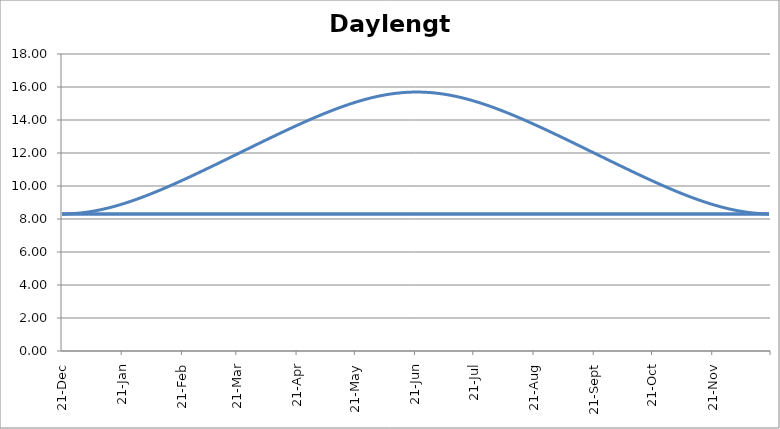
| Category | Daylength |
|---|---|
| 2006-12-21 | 8.306 |
| 2006-12-22 | 8.307 |
| 2006-12-23 | 8.309 |
| 2006-12-24 | 8.312 |
| 2006-12-25 | 8.317 |
| 2006-12-26 | 8.323 |
| 2006-12-27 | 8.33 |
| 2006-12-28 | 8.338 |
| 2006-12-29 | 8.348 |
| 2006-12-30 | 8.36 |
| 2006-12-31 | 8.372 |
| 2007-01-01 | 8.386 |
| 2007-01-02 | 8.401 |
| 2007-01-03 | 8.417 |
| 2007-01-04 | 8.435 |
| 2007-01-05 | 8.453 |
| 2007-01-06 | 8.473 |
| 2007-01-07 | 8.494 |
| 2007-01-08 | 8.517 |
| 2007-01-09 | 8.54 |
| 2007-01-10 | 8.565 |
| 2007-01-11 | 8.59 |
| 2007-01-12 | 8.617 |
| 2007-01-13 | 8.645 |
| 2007-01-14 | 8.674 |
| 2007-01-15 | 8.704 |
| 2007-01-16 | 8.735 |
| 2007-01-17 | 8.767 |
| 2007-01-18 | 8.8 |
| 2007-01-19 | 8.834 |
| 2007-01-20 | 8.869 |
| 2007-01-21 | 8.904 |
| 2007-01-22 | 8.941 |
| 2007-01-23 | 8.978 |
| 2007-01-24 | 9.017 |
| 2007-01-25 | 9.056 |
| 2007-01-26 | 9.096 |
| 2007-01-27 | 9.137 |
| 2007-01-28 | 9.178 |
| 2007-01-29 | 9.22 |
| 2007-01-30 | 9.263 |
| 2007-01-31 | 9.307 |
| 2007-02-01 | 9.351 |
| 2007-02-02 | 9.396 |
| 2007-02-03 | 9.442 |
| 2007-02-04 | 9.488 |
| 2007-02-05 | 9.535 |
| 2007-02-06 | 9.582 |
| 2007-02-07 | 9.63 |
| 2007-02-08 | 9.678 |
| 2007-02-09 | 9.727 |
| 2007-02-10 | 9.776 |
| 2007-02-11 | 9.826 |
| 2007-02-12 | 9.876 |
| 2007-02-13 | 9.927 |
| 2007-02-14 | 9.978 |
| 2007-02-15 | 10.03 |
| 2007-02-16 | 10.082 |
| 2007-02-17 | 10.134 |
| 2007-02-18 | 10.187 |
| 2007-02-19 | 10.24 |
| 2007-02-20 | 10.293 |
| 2007-02-21 | 10.346 |
| 2007-02-22 | 10.4 |
| 2007-02-23 | 10.455 |
| 2007-02-24 | 10.509 |
| 2007-02-25 | 10.564 |
| 2007-02-26 | 10.619 |
| 2007-02-27 | 10.674 |
| 2007-02-28 | 10.729 |
| 2007-03-01 | 10.785 |
| 2007-03-02 | 10.841 |
| 2007-03-03 | 10.897 |
| 2007-03-04 | 10.953 |
| 2007-03-05 | 11.009 |
| 2007-03-06 | 11.066 |
| 2007-03-07 | 11.122 |
| 2007-03-08 | 11.179 |
| 2007-03-09 | 11.236 |
| 2007-03-10 | 11.293 |
| 2007-03-11 | 11.35 |
| 2007-03-12 | 11.407 |
| 2007-03-13 | 11.464 |
| 2007-03-14 | 11.522 |
| 2007-03-15 | 11.579 |
| 2007-03-16 | 11.636 |
| 2007-03-17 | 11.694 |
| 2007-03-18 | 11.751 |
| 2007-03-19 | 11.809 |
| 2007-03-20 | 11.867 |
| 2007-03-21 | 11.924 |
| 2007-03-22 | 11.982 |
| 2007-03-23 | 12.04 |
| 2007-03-24 | 12.097 |
| 2007-03-25 | 12.155 |
| 2007-03-26 | 12.213 |
| 2007-03-27 | 12.27 |
| 2007-03-28 | 12.328 |
| 2007-03-29 | 12.385 |
| 2007-03-30 | 12.443 |
| 2007-03-31 | 12.5 |
| 2007-04-01 | 12.557 |
| 2007-04-02 | 12.614 |
| 2007-04-03 | 12.672 |
| 2007-04-04 | 12.729 |
| 2007-04-05 | 12.786 |
| 2007-04-06 | 12.842 |
| 2007-04-07 | 12.899 |
| 2007-04-08 | 12.956 |
| 2007-04-09 | 13.012 |
| 2007-04-10 | 13.068 |
| 2007-04-11 | 13.124 |
| 2007-04-12 | 13.18 |
| 2007-04-13 | 13.236 |
| 2007-04-14 | 13.292 |
| 2007-04-15 | 13.347 |
| 2007-04-16 | 13.402 |
| 2007-04-17 | 13.457 |
| 2007-04-18 | 13.511 |
| 2007-04-19 | 13.566 |
| 2007-04-20 | 13.62 |
| 2007-04-21 | 13.674 |
| 2007-04-22 | 13.727 |
| 2007-04-23 | 13.78 |
| 2007-04-24 | 13.833 |
| 2007-04-25 | 13.886 |
| 2007-04-26 | 13.938 |
| 2007-04-27 | 13.99 |
| 2007-04-28 | 14.041 |
| 2007-04-29 | 14.092 |
| 2007-04-30 | 14.143 |
| 2007-05-01 | 14.193 |
| 2007-05-02 | 14.242 |
| 2007-05-03 | 14.291 |
| 2007-05-04 | 14.34 |
| 2007-05-05 | 14.388 |
| 2007-05-06 | 14.436 |
| 2007-05-07 | 14.483 |
| 2007-05-08 | 14.53 |
| 2007-05-09 | 14.575 |
| 2007-05-10 | 14.621 |
| 2007-05-11 | 14.665 |
| 2007-05-12 | 14.71 |
| 2007-05-13 | 14.753 |
| 2007-05-14 | 14.796 |
| 2007-05-15 | 14.837 |
| 2007-05-16 | 14.879 |
| 2007-05-17 | 14.919 |
| 2007-05-18 | 14.959 |
| 2007-05-19 | 14.998 |
| 2007-05-20 | 15.036 |
| 2007-05-21 | 15.073 |
| 2007-05-22 | 15.109 |
| 2007-05-23 | 15.145 |
| 2007-05-24 | 15.179 |
| 2007-05-25 | 15.213 |
| 2007-05-26 | 15.245 |
| 2007-05-27 | 15.277 |
| 2007-05-28 | 15.307 |
| 2007-05-29 | 15.337 |
| 2007-05-30 | 15.366 |
| 2007-05-31 | 15.393 |
| 2007-06-01 | 15.419 |
| 2007-06-02 | 15.445 |
| 2007-06-03 | 15.469 |
| 2007-06-04 | 15.492 |
| 2007-06-05 | 15.514 |
| 2007-06-06 | 15.534 |
| 2007-06-07 | 15.554 |
| 2007-06-08 | 15.572 |
| 2007-06-09 | 15.589 |
| 2007-06-10 | 15.605 |
| 2007-06-11 | 15.62 |
| 2007-06-12 | 15.633 |
| 2007-06-13 | 15.645 |
| 2007-06-14 | 15.656 |
| 2007-06-15 | 15.665 |
| 2007-06-16 | 15.673 |
| 2007-06-17 | 15.68 |
| 2007-06-18 | 15.685 |
| 2007-06-19 | 15.689 |
| 2007-06-20 | 15.692 |
| 2007-06-21 | 15.694 |
| 2007-06-22 | 15.694 |
| 2007-06-23 | 15.693 |
| 2007-06-24 | 15.69 |
| 2007-06-25 | 15.686 |
| 2007-06-26 | 15.681 |
| 2007-06-27 | 15.675 |
| 2007-06-28 | 15.667 |
| 2007-06-29 | 15.658 |
| 2007-06-30 | 15.648 |
| 2007-07-01 | 15.636 |
| 2007-07-02 | 15.623 |
| 2007-07-03 | 15.609 |
| 2007-07-04 | 15.593 |
| 2007-07-05 | 15.577 |
| 2007-07-06 | 15.559 |
| 2007-07-07 | 15.539 |
| 2007-07-08 | 15.519 |
| 2007-07-09 | 15.497 |
| 2007-07-10 | 15.475 |
| 2007-07-11 | 15.451 |
| 2007-07-12 | 15.426 |
| 2007-07-13 | 15.4 |
| 2007-07-14 | 15.373 |
| 2007-07-15 | 15.344 |
| 2007-07-16 | 15.315 |
| 2007-07-17 | 15.285 |
| 2007-07-18 | 15.253 |
| 2007-07-19 | 15.221 |
| 2007-07-20 | 15.188 |
| 2007-07-21 | 15.153 |
| 2007-07-22 | 15.118 |
| 2007-07-23 | 15.082 |
| 2007-07-24 | 15.045 |
| 2007-07-25 | 15.007 |
| 2007-07-26 | 14.969 |
| 2007-07-27 | 14.929 |
| 2007-07-28 | 14.889 |
| 2007-07-29 | 14.848 |
| 2007-07-30 | 14.806 |
| 2007-07-31 | 14.764 |
| 2007-08-01 | 14.72 |
| 2007-08-02 | 14.677 |
| 2007-08-03 | 14.632 |
| 2007-08-04 | 14.587 |
| 2007-08-05 | 14.541 |
| 2007-08-06 | 14.495 |
| 2007-08-07 | 14.448 |
| 2007-08-08 | 14.4 |
| 2007-08-09 | 14.352 |
| 2007-08-10 | 14.304 |
| 2007-08-11 | 14.255 |
| 2007-08-12 | 14.205 |
| 2007-08-13 | 14.155 |
| 2007-08-14 | 14.105 |
| 2007-08-15 | 14.054 |
| 2007-08-16 | 14.002 |
| 2007-08-17 | 13.951 |
| 2007-08-18 | 13.899 |
| 2007-08-19 | 13.846 |
| 2007-08-20 | 13.794 |
| 2007-08-21 | 13.74 |
| 2007-08-22 | 13.687 |
| 2007-08-23 | 13.633 |
| 2007-08-24 | 13.579 |
| 2007-08-25 | 13.525 |
| 2007-08-26 | 13.47 |
| 2007-08-27 | 13.416 |
| 2007-08-28 | 13.361 |
| 2007-08-29 | 13.305 |
| 2007-08-30 | 13.25 |
| 2007-08-31 | 13.194 |
| 2007-09-01 | 13.138 |
| 2007-09-02 | 13.082 |
| 2007-09-03 | 13.026 |
| 2007-09-04 | 12.97 |
| 2007-09-05 | 12.913 |
| 2007-09-06 | 12.857 |
| 2007-09-07 | 12.8 |
| 2007-09-08 | 12.743 |
| 2007-09-09 | 12.686 |
| 2007-09-10 | 12.629 |
| 2007-09-11 | 12.572 |
| 2007-09-12 | 12.514 |
| 2007-09-13 | 12.457 |
| 2007-09-14 | 12.4 |
| 2007-09-15 | 12.342 |
| 2007-09-16 | 12.284 |
| 2007-09-17 | 12.227 |
| 2007-09-18 | 12.169 |
| 2007-09-19 | 12.112 |
| 2007-09-20 | 12.054 |
| 2007-09-21 | 11.996 |
| 2007-09-22 | 11.939 |
| 2007-09-23 | 11.881 |
| 2007-09-24 | 11.823 |
| 2007-09-25 | 11.766 |
| 2007-09-26 | 11.708 |
| 2007-09-27 | 11.651 |
| 2007-09-28 | 11.593 |
| 2007-09-29 | 11.536 |
| 2007-09-30 | 11.479 |
| 2007-10-01 | 11.421 |
| 2007-10-02 | 11.364 |
| 2007-10-03 | 11.307 |
| 2007-10-04 | 11.25 |
| 2007-10-05 | 11.193 |
| 2007-10-06 | 11.136 |
| 2007-10-07 | 11.08 |
| 2007-10-08 | 11.023 |
| 2007-10-09 | 10.967 |
| 2007-10-10 | 10.911 |
| 2007-10-11 | 10.855 |
| 2007-10-12 | 10.799 |
| 2007-10-13 | 10.743 |
| 2007-10-14 | 10.688 |
| 2007-10-15 | 10.632 |
| 2007-10-16 | 10.577 |
| 2007-10-17 | 10.523 |
| 2007-10-18 | 10.468 |
| 2007-10-19 | 10.414 |
| 2007-10-20 | 10.36 |
| 2007-10-21 | 10.306 |
| 2007-10-22 | 10.253 |
| 2007-10-23 | 10.2 |
| 2007-10-24 | 10.147 |
| 2007-10-25 | 10.095 |
| 2007-10-26 | 10.043 |
| 2007-10-27 | 9.991 |
| 2007-10-28 | 9.94 |
| 2007-10-29 | 9.889 |
| 2007-10-30 | 9.839 |
| 2007-10-31 | 9.789 |
| 2007-11-01 | 9.739 |
| 2007-11-02 | 9.69 |
| 2007-11-03 | 9.642 |
| 2007-11-04 | 9.594 |
| 2007-11-05 | 9.546 |
| 2007-11-06 | 9.499 |
| 2007-11-07 | 9.453 |
| 2007-11-08 | 9.407 |
| 2007-11-09 | 9.362 |
| 2007-11-10 | 9.318 |
| 2007-11-11 | 9.274 |
| 2007-11-12 | 9.231 |
| 2007-11-13 | 9.189 |
| 2007-11-14 | 9.147 |
| 2007-11-15 | 9.106 |
| 2007-11-16 | 9.066 |
| 2007-11-17 | 9.027 |
| 2007-11-18 | 8.988 |
| 2007-11-19 | 8.95 |
| 2007-11-20 | 8.913 |
| 2007-11-21 | 8.877 |
| 2007-11-22 | 8.842 |
| 2007-11-23 | 8.808 |
| 2007-11-24 | 8.775 |
| 2007-11-25 | 8.743 |
| 2007-11-26 | 8.712 |
| 2007-11-27 | 8.681 |
| 2007-11-28 | 8.652 |
| 2007-11-29 | 8.624 |
| 2007-11-30 | 8.597 |
| 2007-12-01 | 8.571 |
| 2007-12-02 | 8.546 |
| 2007-12-03 | 8.522 |
| 2007-12-04 | 8.5 |
| 2007-12-05 | 8.478 |
| 2007-12-06 | 8.458 |
| 2007-12-07 | 8.439 |
| 2007-12-08 | 8.421 |
| 2007-12-09 | 8.405 |
| 2007-12-10 | 8.389 |
| 2007-12-11 | 8.375 |
| 2007-12-12 | 8.363 |
| 2007-12-13 | 8.351 |
| 2007-12-14 | 8.341 |
| 2007-12-15 | 8.332 |
| 2007-12-16 | 8.324 |
| 2007-12-17 | 8.318 |
| 2007-12-18 | 8.313 |
| 2007-12-19 | 8.309 |
| 2007-12-20 | 8.307 |
| 2006-12-21 | 8.306 |